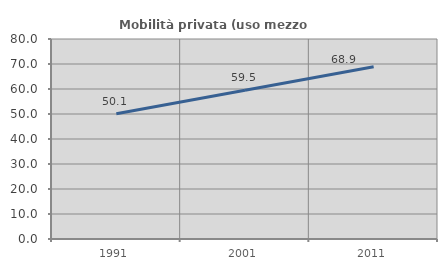
| Category | Mobilità privata (uso mezzo privato) |
|---|---|
| 1991.0 | 50.096 |
| 2001.0 | 59.496 |
| 2011.0 | 68.893 |